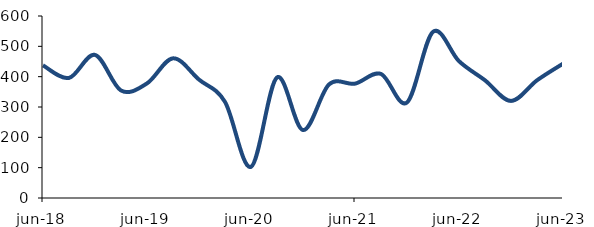
| Category | Series 0 |
|---|---|
| 2018-06-01 | 437.189 |
| 2018-09-01 | 395.802 |
| 2018-12-01 | 471.736 |
| 2019-03-01 | 354.449 |
| 2019-06-01 | 377.802 |
| 2019-09-01 | 460.44 |
| 2019-12-01 | 390.33 |
| 2020-03-01 | 316.807 |
| 2020-06-01 | 102.687 |
| 2020-09-01 | 397.493 |
| 2020-12-01 | 223.873 |
| 2021-03-01 | 374.337 |
| 2021-06-01 | 376.983 |
| 2021-09-01 | 408.944 |
| 2021-12-01 | 314.894 |
| 2022-03-01 | 547.813 |
| 2022-06-01 | 451.084 |
| 2022-09-01 | 387.962 |
| 2022-12-01 | 320.035 |
| 2023-03-01 | 388.008 |
| 2023-06-01 | 442.859 |